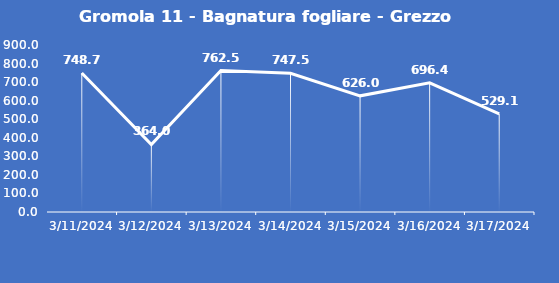
| Category | Gromola 11 - Bagnatura fogliare - Grezzo (min) |
|---|---|
| 3/11/24 | 748.7 |
| 3/12/24 | 364 |
| 3/13/24 | 762.5 |
| 3/14/24 | 747.5 |
| 3/15/24 | 626 |
| 3/16/24 | 696.4 |
| 3/17/24 | 529.1 |